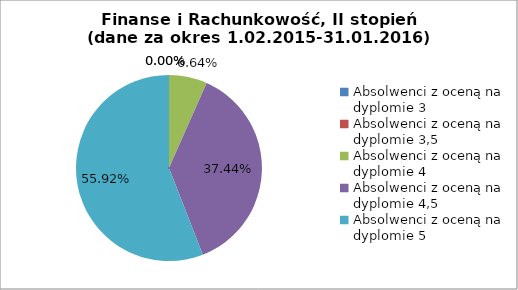
| Category | Series 0 |
|---|---|
| Absolwenci z oceną na dyplomie 3 | 0 |
| Absolwenci z oceną na dyplomie 3,5 | 0 |
| Absolwenci z oceną na dyplomie 4 | 6.635 |
| Absolwenci z oceną na dyplomie 4,5 | 37.441 |
| Absolwenci z oceną na dyplomie 5 | 55.924 |